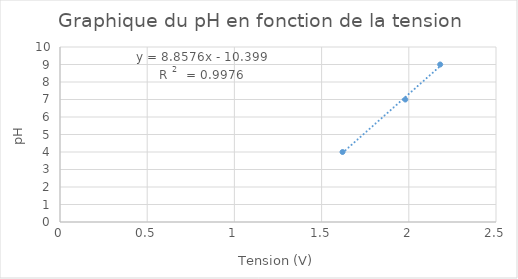
| Category | Series 0 |
|---|---|
| 2.18 | 9 |
| 1.98 | 7 |
| 1.62 | 4 |